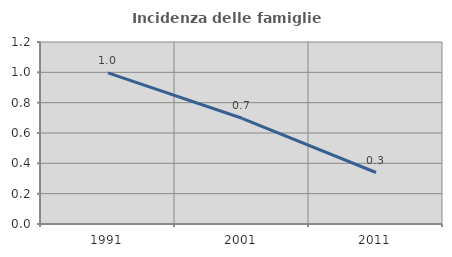
| Category | Incidenza delle famiglie numerose |
|---|---|
| 1991.0 | 0.997 |
| 2001.0 | 0.697 |
| 2011.0 | 0.339 |